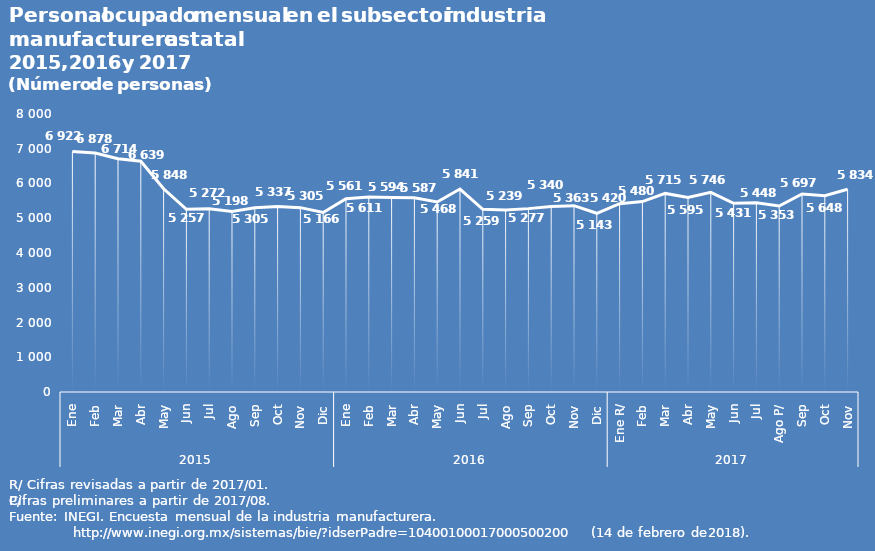
| Category | Series 0 |
|---|---|
| 0 | 6922 |
| 1 | 6878 |
| 2 | 6714 |
| 3 | 6639 |
| 4 | 5848 |
| 5 | 5257 |
| 6 | 5272 |
| 7 | 5198 |
| 8 | 5305 |
| 9 | 5337 |
| 10 | 5305 |
| 11 | 5166 |
| 12 | 5561 |
| 13 | 5611 |
| 14 | 5594 |
| 15 | 5587 |
| 16 | 5468 |
| 17 | 5841 |
| 18 | 5259 |
| 19 | 5239 |
| 20 | 5277 |
| 21 | 5340 |
| 22 | 5363 |
| 23 | 5143 |
| 24 | 5420 |
| 25 | 5480 |
| 26 | 5715 |
| 27 | 5595 |
| 28 | 5746 |
| 29 | 5431 |
| 30 | 5448 |
| 31 | 5353 |
| 32 | 5697 |
| 33 | 5648 |
| 34 | 5834 |